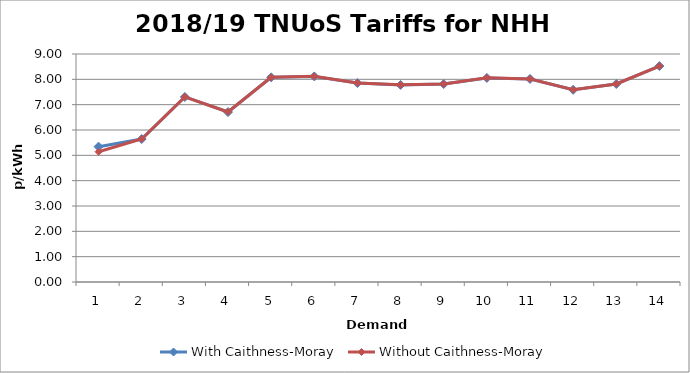
| Category | With Caithness-Moray | Without Caithness-Moray |
|---|---|---|
| 1.0 | 5.342 | 5.142 |
| 2.0 | 5.644 | 5.646 |
| 3.0 | 7.306 | 7.308 |
| 4.0 | 6.71 | 6.712 |
| 5.0 | 8.078 | 8.08 |
| 6.0 | 8.115 | 8.117 |
| 7.0 | 7.855 | 7.857 |
| 8.0 | 7.781 | 7.783 |
| 9.0 | 7.815 | 7.817 |
| 10.0 | 8.056 | 8.059 |
| 11.0 | 8.015 | 8.017 |
| 12.0 | 7.586 | 7.588 |
| 13.0 | 7.817 | 7.818 |
| 14.0 | 8.523 | 8.525 |